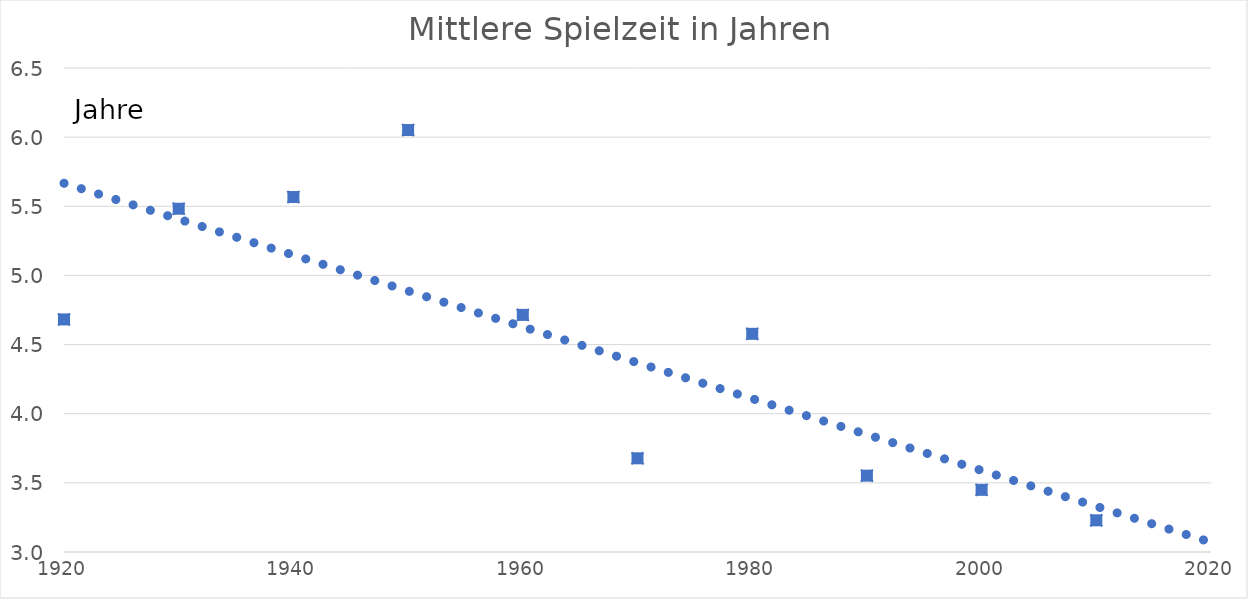
| Category | Series 0 |
|---|---|
| 1920.0 | 4.682 |
| 1930.0 | 5.482 |
| 1940.0 | 5.567 |
| 1950.0 | 6.052 |
| 1960.0 | 4.715 |
| 1970.0 | 3.678 |
| 1980.0 | 4.578 |
| 1990.0 | 3.552 |
| 2000.0 | 3.45 |
| 2010.0 | 3.229 |